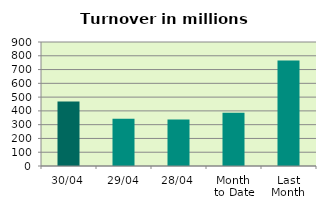
| Category | Series 0 |
|---|---|
| 30/04 | 468.93 |
| 29/04 | 342.748 |
| 28/04 | 338.016 |
| Month 
to Date | 387.046 |
| Last
Month | 765.33 |